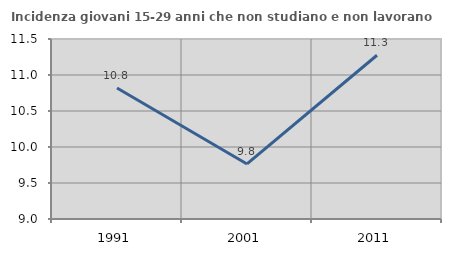
| Category | Incidenza giovani 15-29 anni che non studiano e non lavorano  |
|---|---|
| 1991.0 | 10.82 |
| 2001.0 | 9.765 |
| 2011.0 | 11.274 |